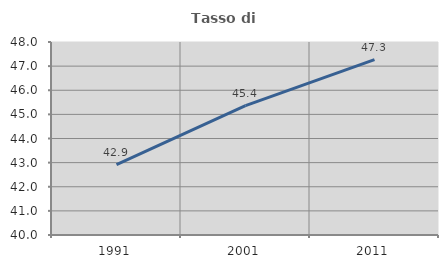
| Category | Tasso di occupazione   |
|---|---|
| 1991.0 | 42.921 |
| 2001.0 | 45.363 |
| 2011.0 | 47.273 |